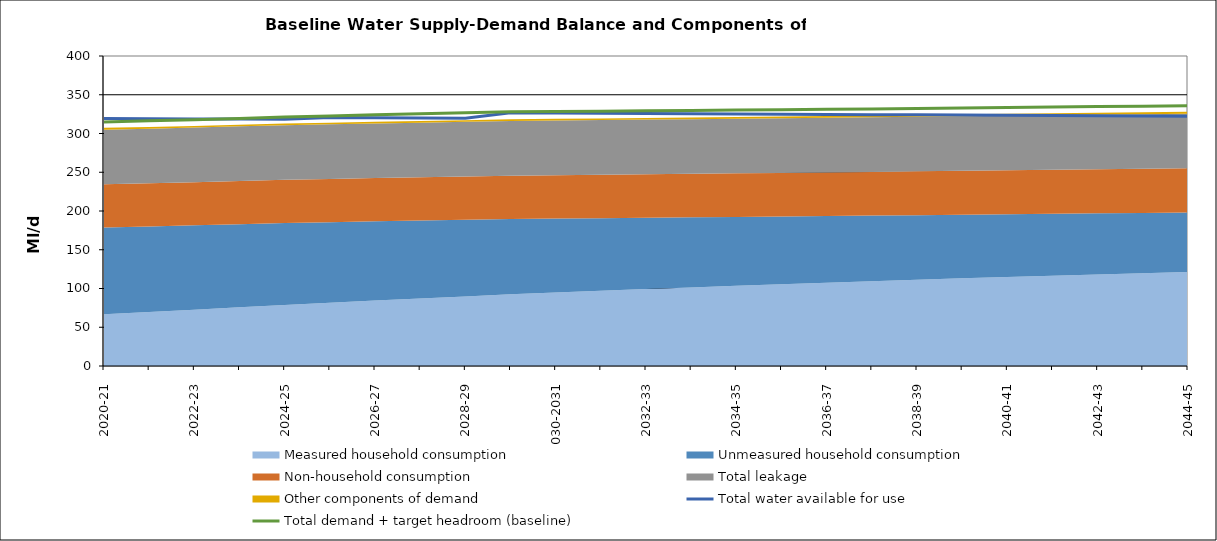
| Category | Total water available for use | Total demand + target headroom (baseline) |
|---|---|---|
| 0 | 319.431 | 314.864 |
| 1 | 319.143 | 316.308 |
| 2 | 318.856 | 317.67 |
| 3 | 318.568 | 319.478 |
| 4 | 318.28 | 321.354 |
| 5 | 320.628 | 322.695 |
| 6 | 320.34 | 324.119 |
| 7 | 320.052 | 325.336 |
| 8 | 319.765 | 326.793 |
| 9 | 326.651 | 328.143 |
| 10 | 326.363 | 328.458 |
| 11 | 326.075 | 328.804 |
| 12 | 325.788 | 329.339 |
| 13 | 325.5 | 329.817 |
| 14 | 325.212 | 330.263 |
| 15 | 324.925 | 330.721 |
| 16 | 324.637 | 331.132 |
| 17 | 324.349 | 331.751 |
| 18 | 324.062 | 332.397 |
| 19 | 323.774 | 332.884 |
| 20 | 323.486 | 333.49 |
| 21 | 323.199 | 334.154 |
| 22 | 322.911 | 334.744 |
| 23 | 322.623 | 335.142 |
| 24 | 322.336 | 335.814 |